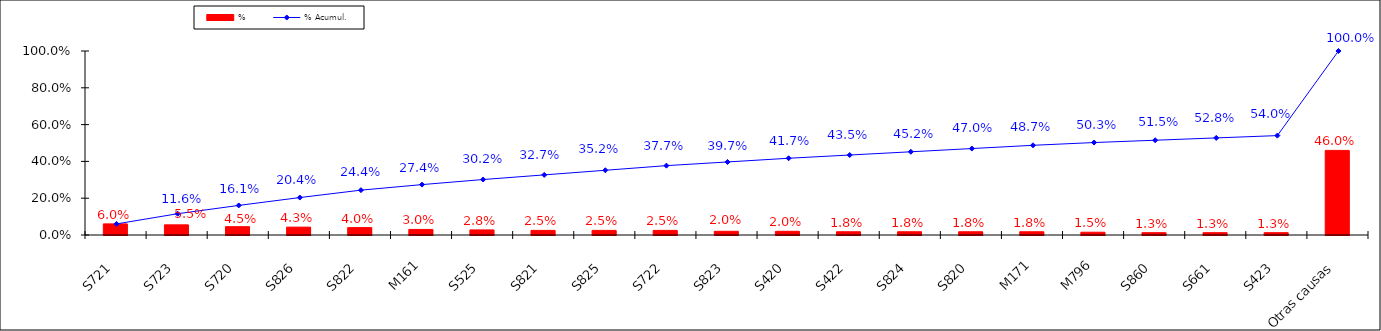
| Category | % |
|---|---|
| S721 | 0.06 |
| S723 | 0.055 |
| S720 | 0.045 |
| S826 | 0.043 |
| S822 | 0.04 |
| M161 | 0.03 |
| S525 | 0.028 |
| S821 | 0.025 |
| S825 | 0.025 |
| S722 | 0.025 |
| S823 | 0.02 |
| S420 | 0.02 |
| S422 | 0.018 |
| S824 | 0.018 |
| S820 | 0.018 |
| M171 | 0.018 |
| M796 | 0.015 |
| S860 | 0.013 |
| S661 | 0.013 |
| S423 | 0.013 |
| Otras causas | 0.46 |